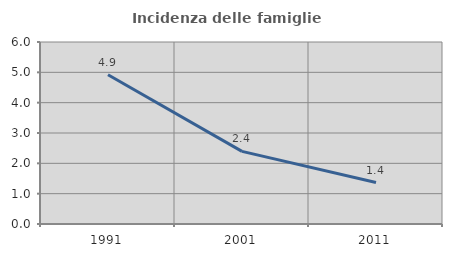
| Category | Incidenza delle famiglie numerose |
|---|---|
| 1991.0 | 4.92 |
| 2001.0 | 2.395 |
| 2011.0 | 1.366 |